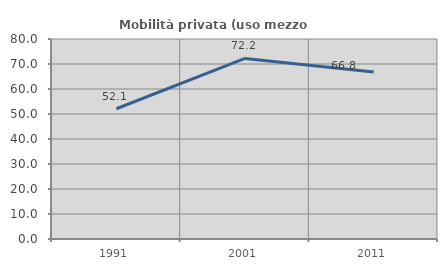
| Category | Mobilità privata (uso mezzo privato) |
|---|---|
| 1991.0 | 52.101 |
| 2001.0 | 72.245 |
| 2011.0 | 66.781 |